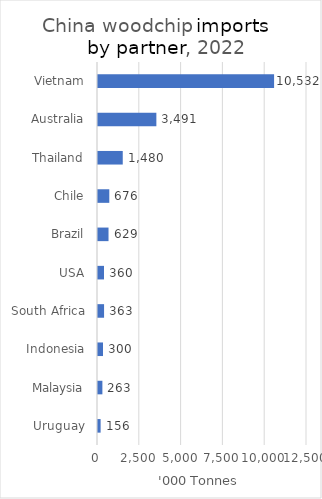
| Category | Series 0 |
|---|---|
| Vietnam | 10531727208 |
| Australia | 3490786600 |
| Thailand | 1480215200 |
| Chile | 675622230 |
| Brazil | 629167800 |
| USA | 360212438 |
| South Africa | 362942600 |
| Indonesia | 300078556 |
| Malaysia | 262575400 |
| Uruguay | 156475415 |